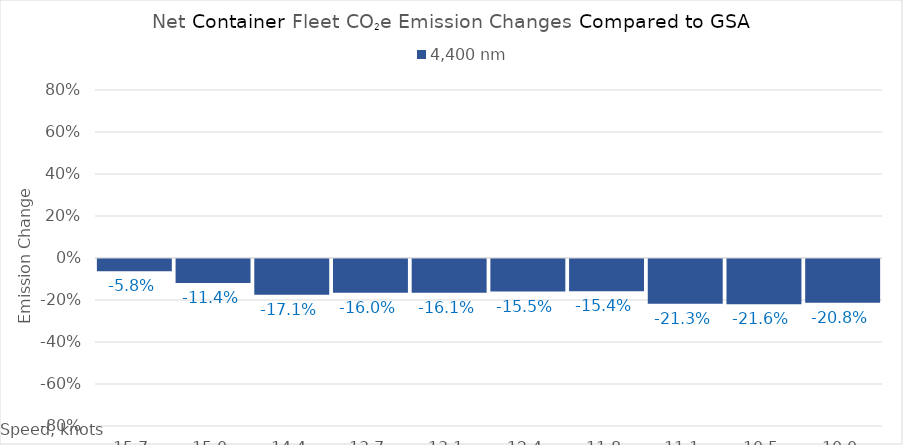
| Category | 4,400 |
|---|---|
| 15.65 | -0.058 |
| 15.0 | -0.114 |
| 14.35 | -0.171 |
| 13.7 | -0.16 |
| 13.049999999999999 | -0.161 |
| 12.399999999999999 | -0.155 |
| 11.749999999999998 | -0.154 |
| 11.099999999999998 | -0.213 |
| 10.449999999999998 | -0.216 |
| 10.0 | -0.208 |